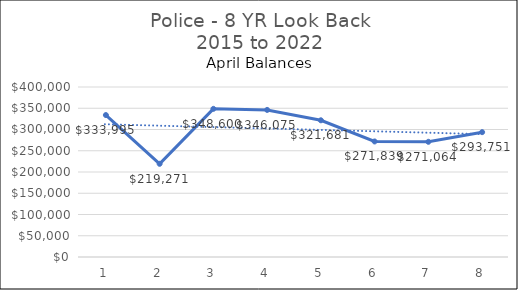
| Category | Police |
|---|---|
| 0 | 333994.64 |
| 1 | 219270.8 |
| 2 | 348599.55 |
| 3 | 346075.29 |
| 4 | 321680.64 |
| 5 | 271839.31 |
| 6 | 271063.75 |
| 7 | 293751.27 |